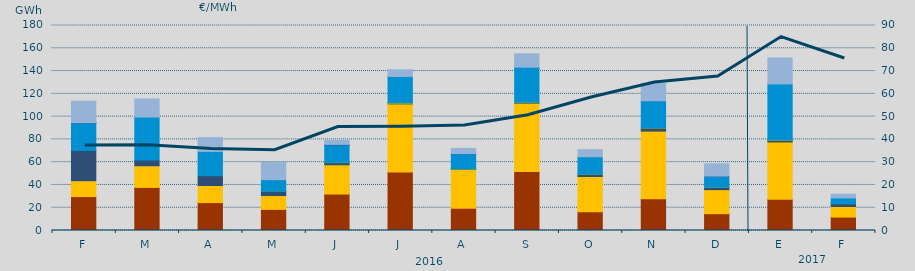
| Category | Carbón | Ciclo Combinado | Cogeneración | Consumo Bombeo | Eólica | Hidráulica | Nuclear | Turbinación bombeo |
|---|---|---|---|---|---|---|---|---|
| F | 29783.2 | 13923.2 | 0 | 26573.5 | 0 | 24211.5 | 221 | 18786.4 |
| M | 37820.3 | 19028.5 | 23.8 | 4950.8 | 0 | 37761.8 | 0 | 15892.4 |
| A | 24502 | 15019.4 | 0 | 8611 | 0 | 21323 | 0 | 12131.8 |
| M | 18542.9 | 12194.7 | 0 | 3802.8 | 29.4 | 10110.1 | 0 | 15019.5 |
| J | 32003.2 | 25715 | 0 | 1834 | 309.7 | 15345.5 | 404.7 | 3667.5 |
| J | 51324.2 | 59857.5 | 0 | 381.3 | 830.5 | 22884.7 | 0 | 5850 |
| A | 19608 | 34074 | 0 | 154.8 | 407.6 | 13164.8 | 150 | 4538.1 |
| S | 51777.2 | 60003.2 | 0 | 418.8 | 585.4 | 30624.4 | 0 | 11791 |
| O | 16527.1 | 30870.5 | 0 | 2014.8 | 341.7 | 14982.5 | 0 | 6233.4 |
| N | 27911.6 | 59353 | 0 | 2603.5 | 562.8 | 23494.9 | 0 | 15319.9 |
| D | 14759.8 | 21112.2 | 0 | 2054.9 | 290 | 9517.7 | 60 | 10705.2 |
| E | 27333.2 | 50390.4 | 0 | 1420.1 | 796.7 | 48799.7 | 0 | 22768.5 |
| F | 11782.3 | 9297.4 | 0 | 2429.3 | 37.7 | 5011.6 | 0 | 3301.6 |